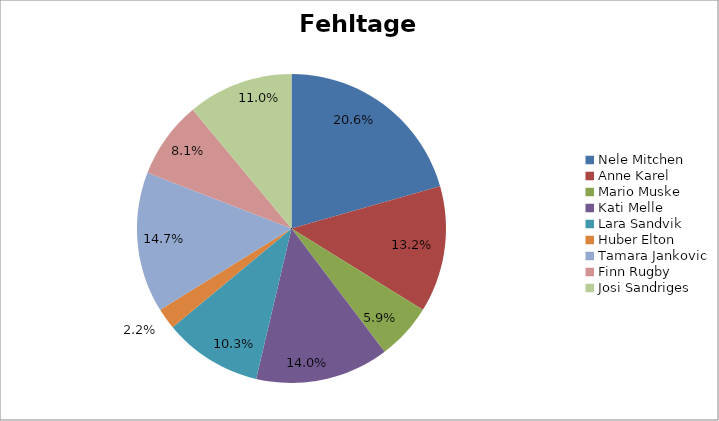
| Category | Series 0 | Series 1 |
|---|---|---|
| Nele Mitchen | 0.206 | 820 |
| Anne Karel | 0.132 | 680 |
| Mario Muske | 0.059 | 540 |
| Kati Melle | 0.14 | 790 |
| Lara Sandvik | 0.103 | 790 |
| Huber Elton | 0.022 | 540 |
| Tamara Jankovic | 0.147 | 680 |
| Finn Rugby | 0.081 | 540 |
| Josi Sandriges | 0.11 | 680 |